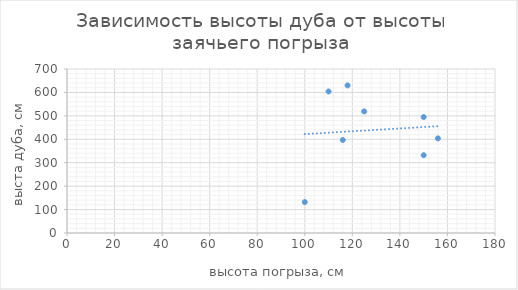
| Category | Series 0 |
|---|---|
| 156.0 | 404 |
| 118.0 | 630 |
| 150.0 | 332 |
| 100.0 | 132 |
| 150.0 | 495 |
| 116.0 | 397 |
| 110.0 | 604 |
| 125.0 | 519 |